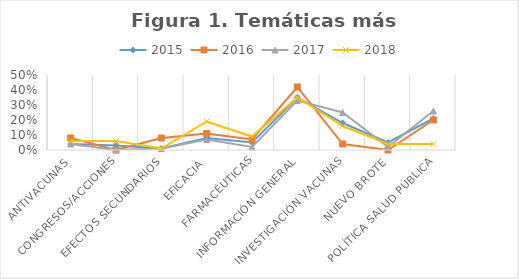
| Category | 2015 | 2016 | 2017 | 2018 |
|---|---|---|---|---|
| Antivacunas | 0.04 | 0.08 | 0.04 | 0.06 |
| Congresos/Acciones | 0.03 | 0 | 0 | 0.06 |
| Efectos Secundarios | 0.01 | 0.08 | 0.01 | 0.01 |
| Eficacia | 0.08 | 0.11 | 0.07 | 0.19 |
| Farmacéuticas | 0.05 | 0.07 | 0.02 | 0.09 |
| Información General | 0.35 | 0.42 | 0.33 | 0.35 |
| Investigación Vacunas | 0.18 | 0.04 | 0.25 | 0.16 |
| Nuevo Brote | 0.05 | 0 | 0.02 | 0.04 |
| Política Salud Pública | 0.21 | 0.2 | 0.26 | 0.04 |